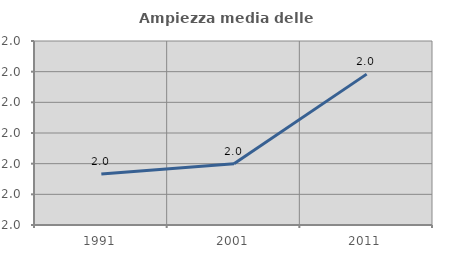
| Category | Ampiezza media delle famiglie |
|---|---|
| 1991.0 | 1.997 |
| 2001.0 | 2 |
| 2011.0 | 2.029 |